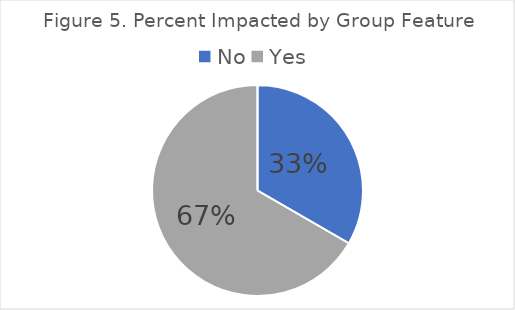
| Category | Impact by "group feature" |
|---|---|
| No | 5 |
| Yes | 10 |